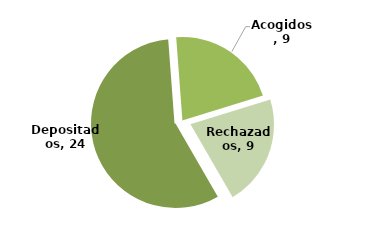
| Category | Series 0 |
|---|---|
| Depositados | 24 |
| Acogidos | 9 |
| Rechazados | 9 |